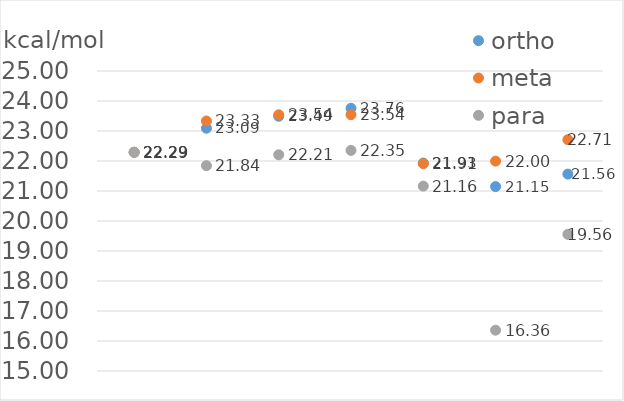
| Category | ortho | meta | para |
|---|---|---|---|
| 0 | 22.291 | 22.291 | 22.291 |
| 1 | 23.093 | 23.333 | 21.844 |
| 2 | 23.491 | 23.539 | 22.207 |
| 3 | 23.758 | 23.544 | 22.353 |
| 4 | 21.931 | 21.913 | 21.163 |
| 5 | 21.147 | 21.996 | 16.361 |
| 6 | 21.564 | 22.711 | 19.555 |